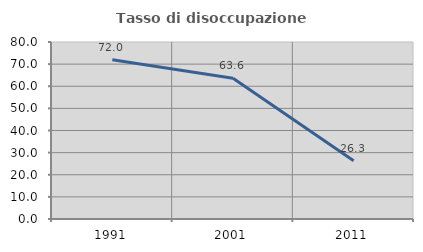
| Category | Tasso di disoccupazione giovanile  |
|---|---|
| 1991.0 | 72 |
| 2001.0 | 63.636 |
| 2011.0 | 26.316 |